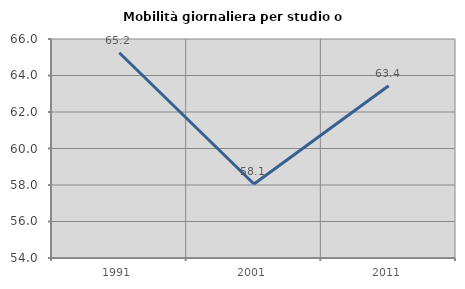
| Category | Mobilità giornaliera per studio o lavoro |
|---|---|
| 1991.0 | 65.247 |
| 2001.0 | 58.052 |
| 2011.0 | 63.44 |